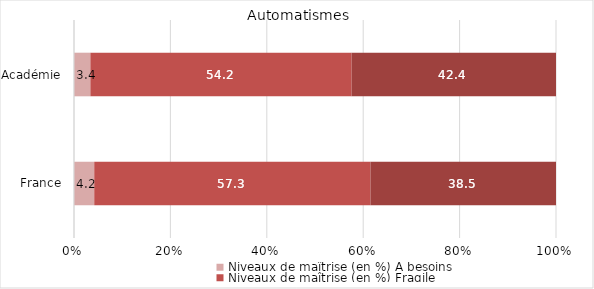
| Category | Niveaux de maîtrise (en %) |
|---|---|
| France | 38.5 |
| Académie | 42.4 |